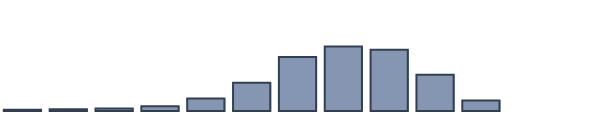
| Category | Series 0 |
|---|---|
| 0 | 0.435 |
| 1 | 0.609 |
| 2 | 0.913 |
| 3 | 1.696 |
| 4 | 4.522 |
| 5 | 10.217 |
| 6 | 19.478 |
| 7 | 23.217 |
| 8 | 22.043 |
| 9 | 13.087 |
| 10 | 3.783 |
| 11 | 0 |
| 12 | 0 |